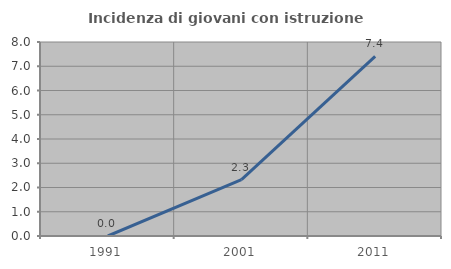
| Category | Incidenza di giovani con istruzione universitaria |
|---|---|
| 1991.0 | 0 |
| 2001.0 | 2.326 |
| 2011.0 | 7.407 |